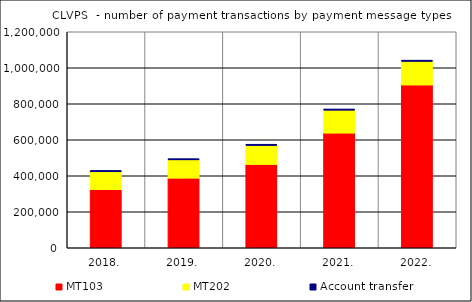
| Category | MT103 | MT202 | Account transfer |
|---|---|---|---|
| 2018. | 322916 | 99163 | 7768 |
| 2019. | 386560 | 101849 | 6829 |
| 2020. | 463022 | 105582 | 6676 |
| 2021. | 636960 | 127507 | 6709 |
| 2022. | 904261 | 131275 | 6833 |